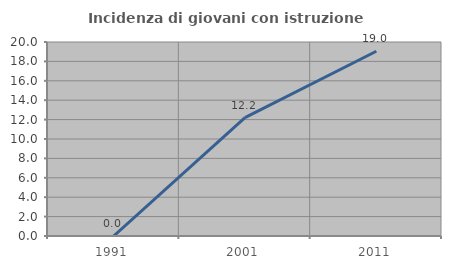
| Category | Incidenza di giovani con istruzione universitaria |
|---|---|
| 1991.0 | 0 |
| 2001.0 | 12.195 |
| 2011.0 | 19.048 |